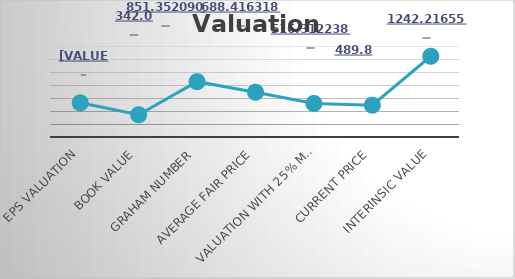
| Category | Series 0 |
|---|---|
| EPS Valuation | 525.481 |
| Book value | 342.08 |
| Graham Number | 851.352 |
| Average Fair Price | 688.416 |
| Valuation with 25% Margin of safety  | 516.312 |
| Current Price | 489.8 |
| Interinsic Value | 1242.217 |